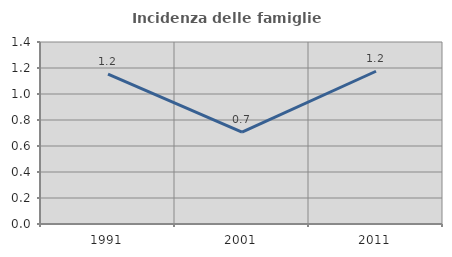
| Category | Incidenza delle famiglie numerose |
|---|---|
| 1991.0 | 1.152 |
| 2001.0 | 0.707 |
| 2011.0 | 1.175 |